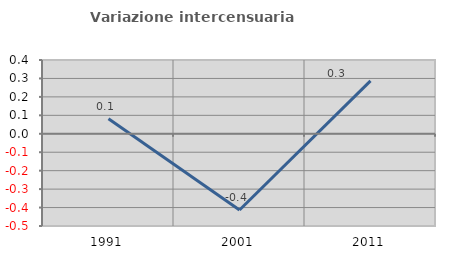
| Category | Variazione intercensuaria annua |
|---|---|
| 1991.0 | 0.082 |
| 2001.0 | -0.413 |
| 2011.0 | 0.287 |